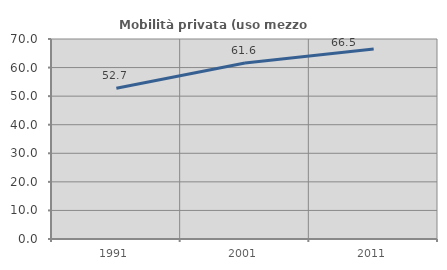
| Category | Mobilità privata (uso mezzo privato) |
|---|---|
| 1991.0 | 52.735 |
| 2001.0 | 61.593 |
| 2011.0 | 66.47 |